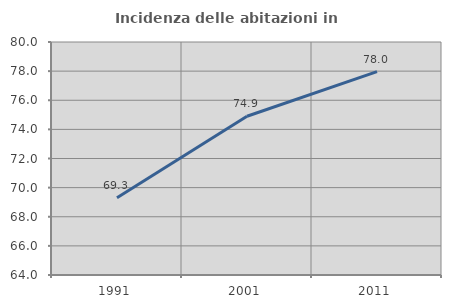
| Category | Incidenza delle abitazioni in proprietà  |
|---|---|
| 1991.0 | 69.307 |
| 2001.0 | 74.902 |
| 2011.0 | 77.964 |